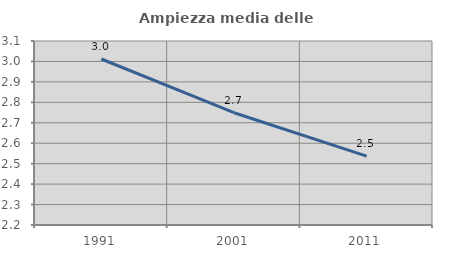
| Category | Ampiezza media delle famiglie |
|---|---|
| 1991.0 | 3.012 |
| 2001.0 | 2.749 |
| 2011.0 | 2.537 |